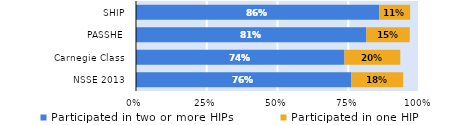
| Category | Participated in two or more HIPs | Participated in one HIP |
|---|---|---|
| NSSE 2013 | 0.761 | 0.184 |
| Carnegie Class | 0.737 | 0.197 |
| PASSHE | 0.814 | 0.153 |
| SHIP | 0.859 | 0.109 |